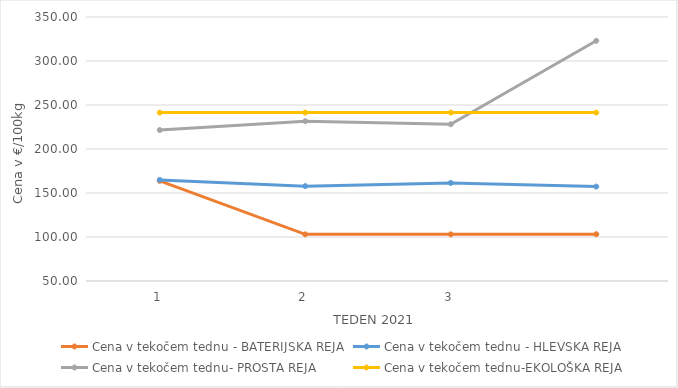
| Category | Cena v tekočem tednu - BATERIJSKA REJA | Cena v tekočem tednu - HLEVSKA REJA | Cena v tekočem tednu- PROSTA REJA | Cena v tekočem tednu-EKOLOŠKA REJA |
|---|---|---|---|---|
| 1.0 | 163.81 | 164.86 | 221.55 | 241.38 |
| 2.0 | 103.02 | 157.81 | 231.55 | 241.38 |
| 3.0 | 103.03 | 161.48 | 228.1 | 241.38 |